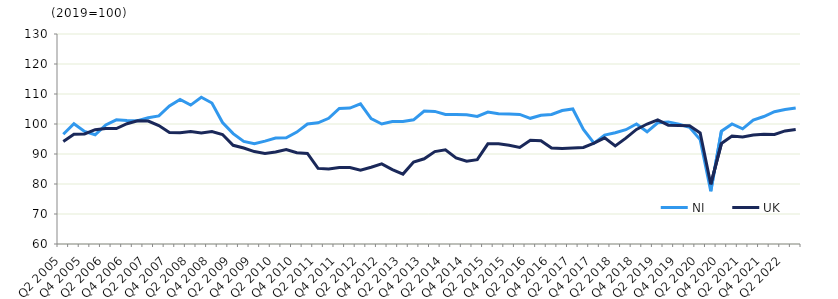
| Category | NI | UK  |
|---|---|---|
| Q2 2005 | 96.6 | 94.2 |
|  | 100.1 | 96.6 |
| Q4 2005 | 97.5 | 96.7 |
|  | 96.4 | 98.1 |
| Q2 2006 | 99.7 | 98.5 |
|  | 101.4 | 98.5 |
| Q4 2006 | 101.2 | 100.1 |
|  | 101.1 | 101.1 |
| Q2 2007 | 102.1 | 101 |
|  | 102.7 | 99.5 |
| Q4 2007 | 106 | 97.2 |
|  | 108.2 | 97.1 |
| Q2 2008 | 106.3 | 97.5 |
|  | 108.9 | 97 |
| Q4 2008 | 107 | 97.5 |
|  | 100.5 | 96.5 |
| Q2 2009 | 96.8 | 92.9 |
|  | 94.2 | 92 |
| Q4 2009 | 93.4 | 90.8 |
|  | 94.3 | 90.2 |
| Q2 2010 | 95.3 | 90.7 |
|  | 95.4 | 91.5 |
| Q4 2010 | 97.3 | 90.4 |
|  | 100 | 90.2 |
| Q2 2011 | 100.4 | 85.2 |
|  | 101.9 | 85 |
| Q4 2011 | 105.2 | 85.5 |
|  | 105.3 | 85.5 |
| Q2 2012 | 106.7 | 84.6 |
|  | 101.8 | 85.6 |
| Q4 2012 | 100 | 86.7 |
|  | 100.8 | 84.8 |
| Q2 2013 | 100.8 | 83.3 |
|  | 101.4 | 87.3 |
| Q4 2013 | 104.3 | 88.4 |
|  | 104.2 | 90.8 |
| Q2 2014 | 103.2 | 91.4 |
|  | 103.2 | 88.7 |
| Q4 2014 | 103.1 | 87.6 |
|  | 102.5 | 88.1 |
| Q2 2015 | 104 | 93.4 |
|  | 103.4 | 93.4 |
| Q4 2015 | 103.3 | 92.9 |
|  | 103.2 | 92.2 |
| Q2 2016 | 101.9 | 94.6 |
|  | 102.9 | 94.4 |
| Q4 2016 | 103.2 | 92 |
|  | 104.5 | 91.8 |
| Q2 2017 | 105 | 92 |
|  | 98.2 | 92.2 |
| Q4 2017 | 93.6 | 93.6 |
|  | 96.3 | 95.4 |
| Q2 2018 | 97.1 | 92.7 |
|  | 98.1 | 95.3 |
| Q4 2018 | 100 | 98.2 |
|  | 97.4 | 100 |
| Q2 2019 | 100.4 | 101.4 |
|  | 100.7 | 99.6 |
| Q4 2019 | 99.9 | 99.5 |
|  | 98.9 | 99.4 |
| Q2 2020 | 94.8 | 97 |
|  | 77.6 | 79.9 |
| Q4 2020 | 97.6 | 93.5 |
|  | 100 | 96 |
| Q2 2021 | 98.4 | 95.7 |
|  | 101.3 | 96.3 |
| Q4 2021 | 102.5 | 96.6 |
|  | 104.1 | 96.5 |
| Q2 2022 | 104.8 | 97.7 |